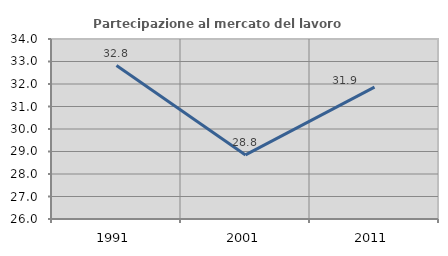
| Category | Partecipazione al mercato del lavoro  femminile |
|---|---|
| 1991.0 | 32.819 |
| 2001.0 | 28.848 |
| 2011.0 | 31.863 |